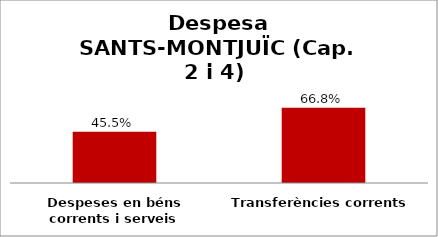
| Category | Series 0 |
|---|---|
| Despeses en béns corrents i serveis | 0.455 |
| Transferències corrents | 0.668 |